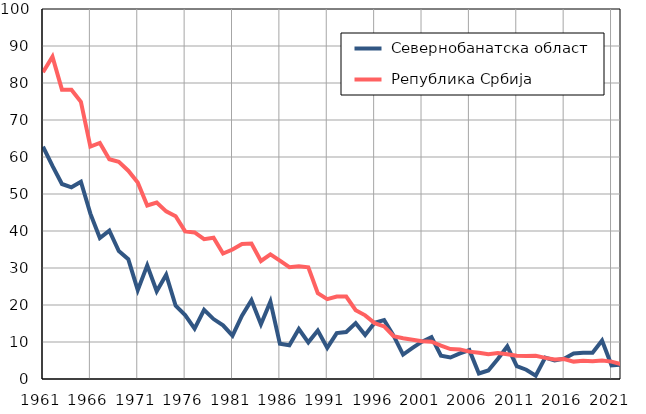
| Category |  Севернобанатска област |  Република Србија |
|---|---|---|
| 1961.0 | 62.8 | 82.9 |
| 1962.0 | 57.6 | 87.1 |
| 1963.0 | 52.7 | 78.2 |
| 1964.0 | 51.8 | 78.2 |
| 1965.0 | 53.3 | 74.9 |
| 1966.0 | 44.7 | 62.8 |
| 1967.0 | 38.1 | 63.8 |
| 1968.0 | 40.1 | 59.4 |
| 1969.0 | 34.6 | 58.7 |
| 1970.0 | 32.4 | 56.3 |
| 1971.0 | 24 | 53.1 |
| 1972.0 | 30.7 | 46.9 |
| 1973.0 | 23.7 | 47.7 |
| 1974.0 | 28.2 | 45.3 |
| 1975.0 | 19.8 | 44 |
| 1976.0 | 17.3 | 39.9 |
| 1977.0 | 13.6 | 39.6 |
| 1978.0 | 18.7 | 37.8 |
| 1979.0 | 16.2 | 38.2 |
| 1980.0 | 14.5 | 33.9 |
| 1981.0 | 11.7 | 35 |
| 1982.0 | 17.1 | 36.5 |
| 1983.0 | 21.3 | 36.6 |
| 1984.0 | 14.8 | 31.9 |
| 1985.0 | 20.9 | 33.7 |
| 1986.0 | 9.5 | 32 |
| 1987.0 | 9.1 | 30.2 |
| 1988.0 | 13.5 | 30.5 |
| 1989.0 | 9.9 | 30.2 |
| 1990.0 | 13.1 | 23.2 |
| 1991.0 | 8.4 | 21.6 |
| 1992.0 | 12.4 | 22.3 |
| 1993.0 | 12.7 | 22.3 |
| 1994.0 | 15.1 | 18.6 |
| 1995.0 | 11.9 | 17.2 |
| 1996.0 | 15.2 | 15.1 |
| 1997.0 | 15.9 | 14.2 |
| 1998.0 | 11.7 | 11.6 |
| 1999.0 | 6.6 | 11 |
| 2000.0 | 8.4 | 10.6 |
| 2001.0 | 10.1 | 10.2 |
| 2002.0 | 11.3 | 10.1 |
| 2003.0 | 6.3 | 9 |
| 2004.0 | 5.8 | 8.1 |
| 2005.0 | 6.9 | 8 |
| 2006.0 | 7.8 | 7.4 |
| 2007.0 | 1.5 | 7.1 |
| 2008.0 | 2.3 | 6.7 |
| 2009.0 | 5.4 | 7 |
| 2010.0 | 8.8 | 6.7 |
| 2011.0 | 3.5 | 6.3 |
| 2012.0 | 2.5 | 6.2 |
| 2013.0 | 0.9 | 6.3 |
| 2014.0 | 5.8 | 5.7 |
| 2015.0 | 5 | 5.3 |
| 2016.0 | 5.5 | 5.4 |
| 2017.0 | 6.9 | 4.7 |
| 2018.0 | 7.1 | 4.9 |
| 2019.0 | 7.1 | 4.8 |
| 2020.0 | 10.4 | 5 |
| 2021.0 | 3.7 | 4.7 |
| 2022.0 | 3.9 | 4 |